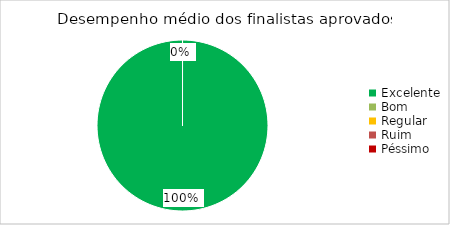
| Category | Total |
|---|---|
| Excelente | 1 |
| Bom | 0 |
| Regular | 0 |
| Ruim | 0 |
| Péssimo | 0 |